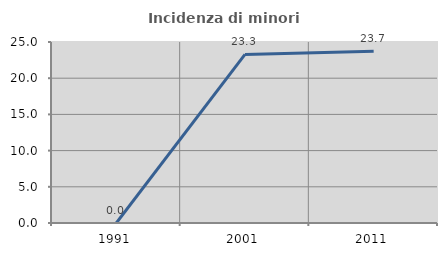
| Category | Incidenza di minori stranieri |
|---|---|
| 1991.0 | 0 |
| 2001.0 | 23.288 |
| 2011.0 | 23.721 |